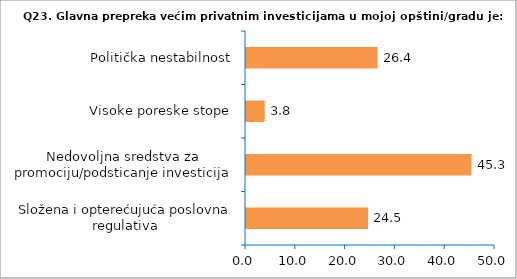
| Category | Series 0 |
|---|---|
| Složena i opterećujuća poslovna regulativa | 24.528 |
| Nedovoljna sredstva za promociju/podsticanje investicija | 45.283 |
| Visoke poreske stope | 3.774 |
| Politička nestabilnost | 26.415 |